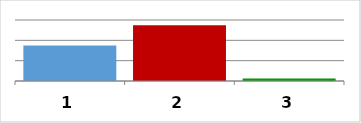
| Category | Series 0 |
|---|---|
| 0 | 34956721.54 |
| 1 | 54925680 |
| 2 | 2500000 |